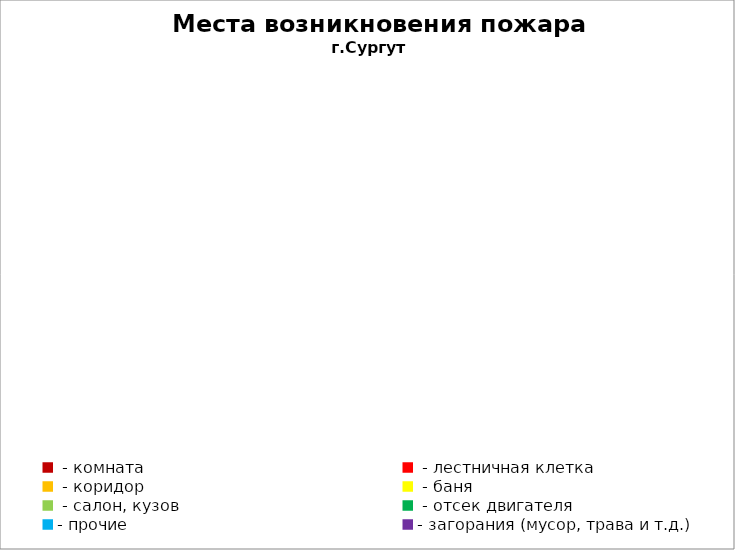
| Category | Места возникновения пожара |
|---|---|
|  - комната | 50 |
|  - лестничная клетка | 21 |
|  - коридор | 9 |
|  - баня | 26 |
|  - салон, кузов | 10 |
|  - отсек двигателя | 28 |
| - прочие | 111 |
| - загорания (мусор, трава и т.д.)  | 160 |